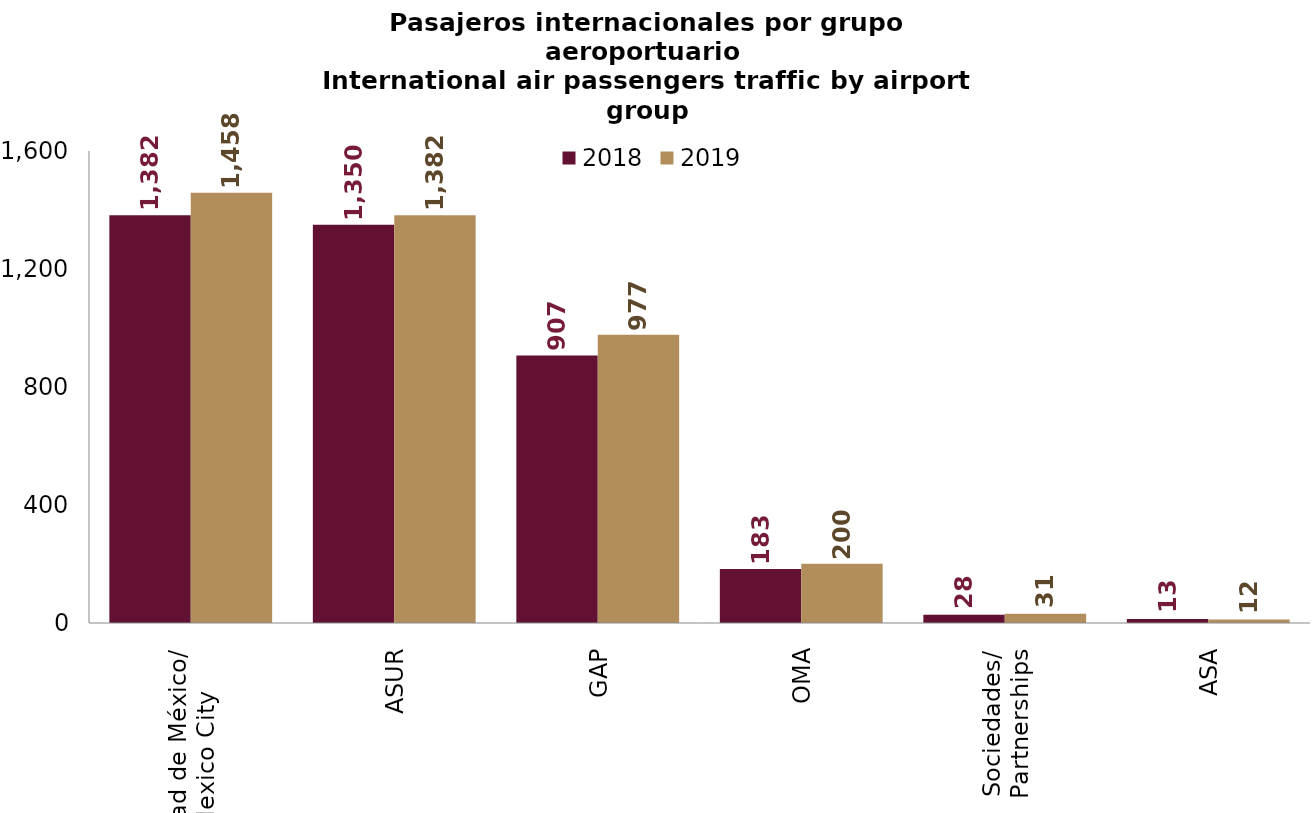
| Category | 2018 | 2019 |
|---|---|---|
| Ciudad de México/
Mexico City | 1381.981 | 1458.486 |
| ASUR | 1350.417 | 1382.146 |
| GAP | 906.984 | 977.325 |
| OMA | 183.009 | 200.498 |
| Sociedades/
Partnerships | 28.134 | 31.269 |
| ASA | 13.205 | 11.75 |